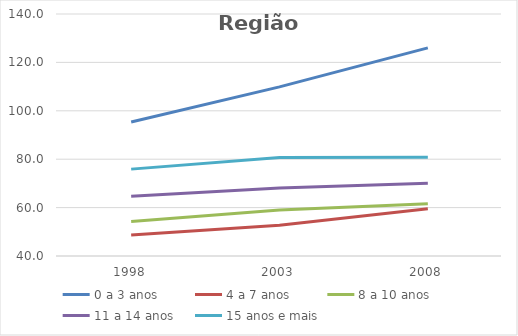
| Category | 0 a 3 anos | 4 a 7 anos | 8 a 10 anos | 11 a 14 anos | 15 anos e mais |
|---|---|---|---|---|---|
| 1998.0 | 95.4 | 48.7 | 54.3 | 64.7 | 75.9 |
| 2003.0 | 109.9 | 52.7 | 59 | 68.1 | 80.7 |
| 2008.0 | 126 | 59.5 | 61.6 | 70.1 | 80.8 |